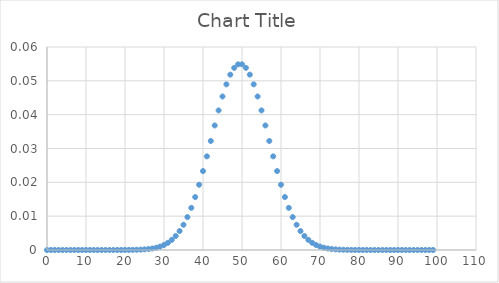
| Category | Series 0 |
|---|---|
| 0.0 | 0 |
| 1.0 | 0 |
| 2.0 | 0 |
| 3.0 | 0 |
| 4.0 | 0 |
| 5.0 | 0 |
| 6.0 | 0 |
| 7.0 | 0 |
| 8.0 | 0 |
| 9.0 | 0 |
| 10.0 | 0 |
| 11.0 | 0 |
| 12.0 | 0 |
| 13.0 | 0 |
| 14.0 | 0 |
| 15.0 | 0 |
| 16.0 | 0 |
| 17.0 | 0 |
| 18.0 | 0 |
| 19.0 | 0 |
| 20.0 | 0 |
| 21.0 | 0 |
| 22.0 | 0 |
| 23.0 | 0 |
| 24.0 | 0 |
| 25.0 | 0 |
| 26.0 | 0 |
| 27.0 | 0 |
| 28.0 | 0.001 |
| 29.0 | 0.001 |
| 30.0 | 0.001 |
| 31.0 | 0.002 |
| 32.0 | 0.003 |
| 33.0 | 0.004 |
| 34.0 | 0.006 |
| 35.0 | 0.007 |
| 36.0 | 0.01 |
| 37.0 | 0.012 |
| 38.0 | 0.016 |
| 39.0 | 0.019 |
| 40.0 | 0.023 |
| 41.0 | 0.028 |
| 42.0 | 0.032 |
| 43.0 | 0.037 |
| 44.0 | 0.041 |
| 45.0 | 0.045 |
| 46.0 | 0.049 |
| 47.0 | 0.052 |
| 48.0 | 0.054 |
| 49.0 | 0.055 |
| 50.0 | 0.055 |
| 51.0 | 0.054 |
| 52.0 | 0.052 |
| 53.0 | 0.049 |
| 54.0 | 0.045 |
| 55.0 | 0.041 |
| 56.0 | 0.037 |
| 57.0 | 0.032 |
| 58.0 | 0.028 |
| 59.0 | 0.023 |
| 60.0 | 0.019 |
| 61.0 | 0.016 |
| 62.0 | 0.012 |
| 63.0 | 0.01 |
| 64.0 | 0.007 |
| 65.0 | 0.006 |
| 66.0 | 0.004 |
| 67.0 | 0.003 |
| 68.0 | 0.002 |
| 69.0 | 0.001 |
| 70.0 | 0.001 |
| 71.0 | 0.001 |
| 72.0 | 0 |
| 73.0 | 0 |
| 74.0 | 0 |
| 75.0 | 0 |
| 76.0 | 0 |
| 77.0 | 0 |
| 78.0 | 0 |
| 79.0 | 0 |
| 80.0 | 0 |
| 81.0 | 0 |
| 82.0 | 0 |
| 83.0 | 0 |
| 84.0 | 0 |
| 85.0 | 0 |
| 86.0 | 0 |
| 87.0 | 0 |
| 88.0 | 0 |
| 89.0 | 0 |
| 90.0 | 0 |
| 91.0 | 0 |
| 92.0 | 0 |
| 93.0 | 0 |
| 94.0 | 0 |
| 95.0 | 0 |
| 96.0 | 0 |
| 97.0 | 0 |
| 98.0 | 0 |
| 99.0 | 0 |